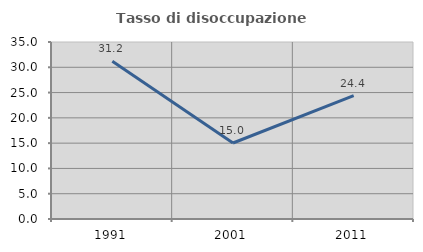
| Category | Tasso di disoccupazione giovanile  |
|---|---|
| 1991.0 | 31.175 |
| 2001.0 | 15.031 |
| 2011.0 | 24.399 |